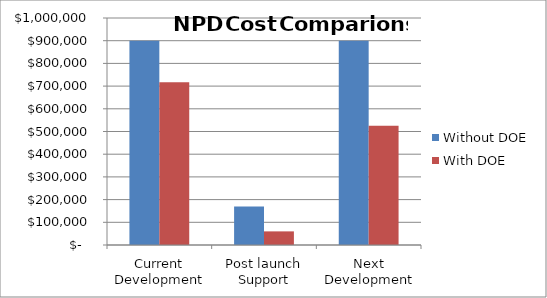
| Category | Without DOE | With DOE |
|---|---|---|
| Current Development | 900000 | 717500 |
| Post launch Support | 170000 | 60000 |
| Next Development | 900000 | 525000 |